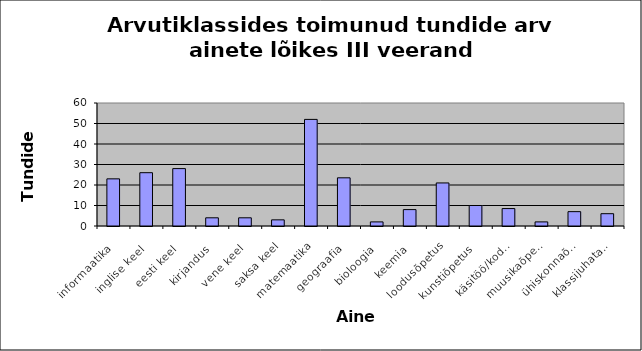
| Category | Series 0 |
|---|---|
| informaatika | 23 |
| inglise keel | 26 |
| eesti keel | 28 |
| kirjandus | 4 |
| vene keel | 4 |
| saksa keel | 3 |
| matemaatika | 52 |
| geograafia | 23.5 |
| bioloogia | 2 |
| keemia | 8 |
| loodusõpetus | 21 |
| kunstiõpetus | 10 |
| käsitöö/kodundus | 8.5 |
| muusikaõpetus | 2 |
| ühiskonnaõpetus | 7 |
| klassijuhatamine | 6 |